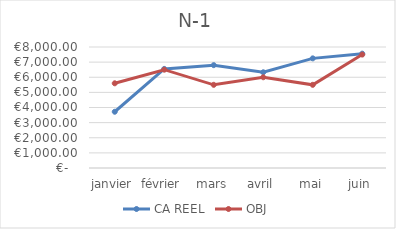
| Category | CA REEL | OBJ |
|---|---|---|
| janvier | 3719 | 5600 |
| février | 6551 | 6500 |
| mars | 6799 | 5500 |
| avril | 6328 | 6000 |
| mai | 7249 | 5500 |
| juin | 7560 | 7500 |